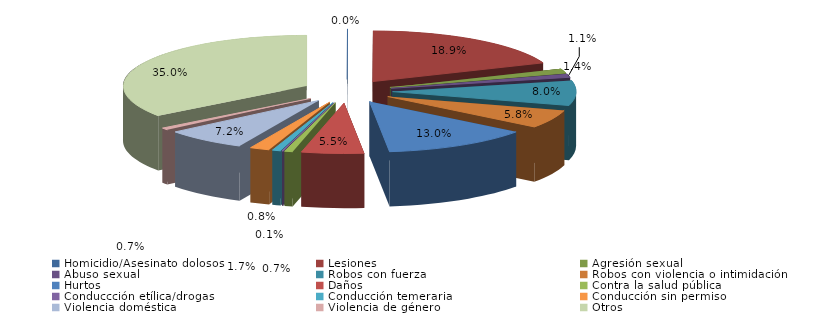
| Category | Series 0 |
|---|---|
| Homicidio/Asesinato dolosos | 1 |
| Lesiones | 576 |
| Agresión sexual | 43 |
| Abuso sexual | 34 |
| Robos con fuerza | 242 |
| Robos con violencia o intimidación | 178 |
| Hurtos | 395 |
| Daños | 167 |
| Contra la salud pública | 22 |
| Conduccción etílica/drogas | 4 |
| Conducción temeraria | 23 |
| Conducción sin permiso | 53 |
| Violencia doméstica | 219 |
| Violencia de género | 21 |
| Otros | 1066 |